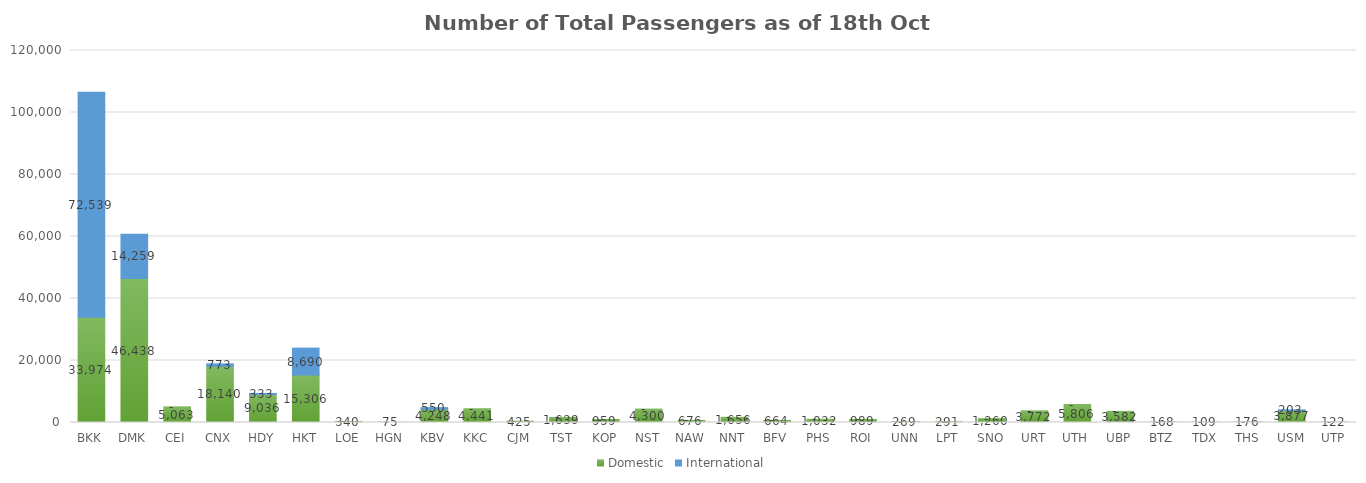
| Category | Domestic | International |
|---|---|---|
| BKK | 33974 | 72539 |
| DMK | 46438 | 14259 |
| CEI | 5063 | 0 |
| CNX | 18140 | 773 |
| HDY | 9036 | 333 |
| HKT | 15306 | 8690 |
| LOE | 340 | 0 |
| HGN | 75 | 0 |
| KBV | 4248 | 550 |
| KKC | 4441 | 0 |
| CJM | 425 | 0 |
| TST | 1639 | 0 |
| KOP | 959 | 0 |
| NST | 4300 | 0 |
| NAW | 676 | 0 |
| NNT | 1656 | 0 |
| BFV | 664 | 0 |
| PHS | 1032 | 0 |
| ROI | 989 | 0 |
| UNN | 269 | 0 |
| LPT | 291 | 0 |
| SNO | 1260 | 0 |
| URT | 3772 | 0 |
| UTH | 5806 | 0 |
| UBP | 3582 | 0 |
| BTZ | 168 | 0 |
| TDX | 109 | 0 |
| THS | 176 | 0 |
| USM | 3877 | 203 |
| UTP | 122 | 0 |